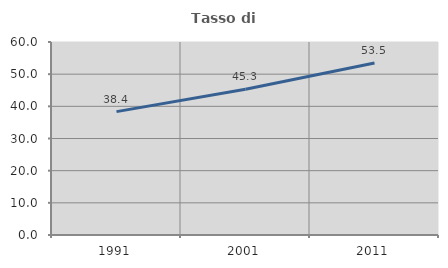
| Category | Tasso di occupazione   |
|---|---|
| 1991.0 | 38.36 |
| 2001.0 | 45.283 |
| 2011.0 | 53.459 |